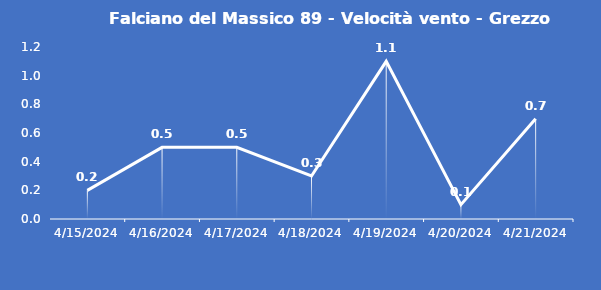
| Category | Falciano del Massico 89 - Velocità vento - Grezzo (m/s) |
|---|---|
| 4/15/24 | 0.2 |
| 4/16/24 | 0.5 |
| 4/17/24 | 0.5 |
| 4/18/24 | 0.3 |
| 4/19/24 | 1.1 |
| 4/20/24 | 0.1 |
| 4/21/24 | 0.7 |